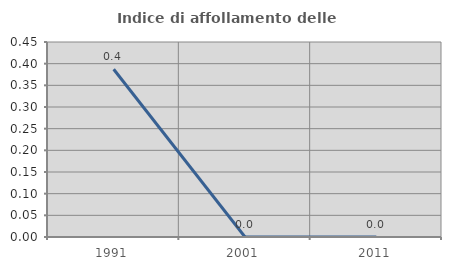
| Category | Indice di affollamento delle abitazioni  |
|---|---|
| 1991.0 | 0.387 |
| 2001.0 | 0 |
| 2011.0 | 0 |